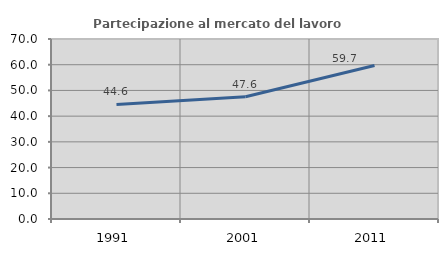
| Category | Partecipazione al mercato del lavoro  femminile |
|---|---|
| 1991.0 | 44.57 |
| 2001.0 | 47.573 |
| 2011.0 | 59.672 |